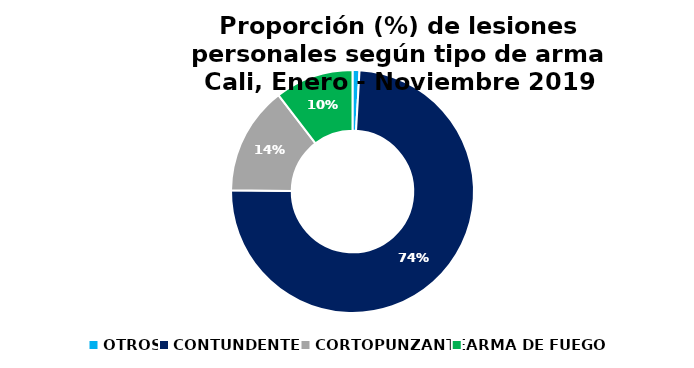
| Category | Series 1 |
|---|---|
| OTROS | 60 |
| CONTUNDENTES | 4812 |
| CORTOPUNZANTE | 934 |
| ARMA DE FUEGO | 676 |